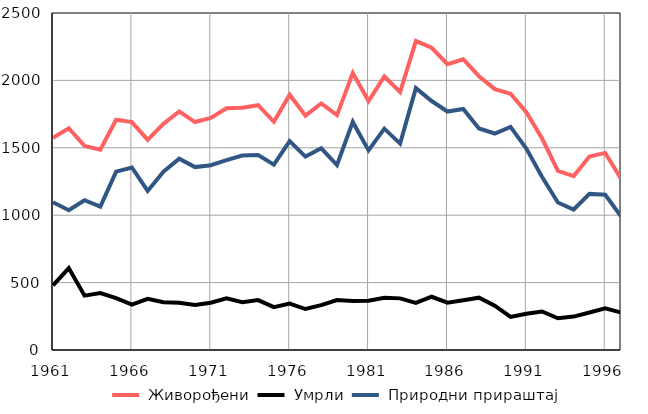
| Category |  Живорођени |  Умрли |  Природни прираштај |
|---|---|---|---|
| 1961.0 | 1575 | 479 | 1096 |
| 1962.0 | 1645 | 608 | 1037 |
| 1963.0 | 1514 | 403 | 1111 |
| 1964.0 | 1486 | 422 | 1064 |
| 1965.0 | 1708 | 385 | 1323 |
| 1966.0 | 1691 | 337 | 1354 |
| 1967.0 | 1559 | 379 | 1180 |
| 1968.0 | 1678 | 355 | 1323 |
| 1969.0 | 1770 | 351 | 1419 |
| 1970.0 | 1691 | 334 | 1357 |
| 1971.0 | 1722 | 351 | 1371 |
| 1972.0 | 1793 | 384 | 1409 |
| 1973.0 | 1797 | 354 | 1443 |
| 1974.0 | 1816 | 370 | 1446 |
| 1975.0 | 1693 | 318 | 1375 |
| 1976.0 | 1894 | 344 | 1550 |
| 1977.0 | 1739 | 304 | 1435 |
| 1978.0 | 1829 | 333 | 1496 |
| 1979.0 | 1742 | 370 | 1372 |
| 1980.0 | 2055 | 363 | 1692 |
| 1981.0 | 1847 | 366 | 1481 |
| 1982.0 | 2029 | 387 | 1642 |
| 1983.0 | 1914 | 383 | 1531 |
| 1984.0 | 2292 | 349 | 1943 |
| 1985.0 | 2242 | 395 | 1847 |
| 1986.0 | 2120 | 351 | 1769 |
| 1987.0 | 2157 | 369 | 1788 |
| 1988.0 | 2031 | 388 | 1643 |
| 1989.0 | 1935 | 329 | 1606 |
| 1990.0 | 1901 | 246 | 1655 |
| 1991.0 | 1764 | 269 | 1495 |
| 1992.0 | 1569 | 286 | 1283 |
| 1993.0 | 1329 | 235 | 1094 |
| 1994.0 | 1290 | 248 | 1042 |
| 1995.0 | 1436 | 278 | 1158 |
| 1996.0 | 1462 | 310 | 1152 |
| 1997.0 | 1270 | 278 | 992 |